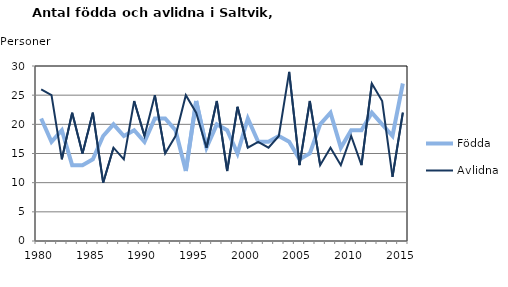
| Category | Födda | Avlidna |
|---|---|---|
| 1980.0 | 21 | 26 |
| 1981.0 | 17 | 25 |
| 1982.0 | 19 | 14 |
| 1983.0 | 13 | 22 |
| 1984.0 | 13 | 15 |
| 1985.0 | 14 | 22 |
| 1986.0 | 18 | 10 |
| 1987.0 | 20 | 16 |
| 1988.0 | 18 | 14 |
| 1989.0 | 19 | 24 |
| 1990.0 | 17 | 18 |
| 1991.0 | 21 | 25 |
| 1992.0 | 21 | 15 |
| 1993.0 | 19 | 18 |
| 1994.0 | 12 | 25 |
| 1995.0 | 24 | 22 |
| 1996.0 | 16 | 16 |
| 1997.0 | 20 | 24 |
| 1998.0 | 19 | 12 |
| 1999.0 | 15 | 23 |
| 2000.0 | 21 | 16 |
| 2001.0 | 17 | 17 |
| 2002.0 | 17 | 16 |
| 2003.0 | 18 | 18 |
| 2004.0 | 17 | 29 |
| 2005.0 | 14 | 13 |
| 2006.0 | 15 | 24 |
| 2007.0 | 20 | 13 |
| 2008.0 | 22 | 16 |
| 2009.0 | 16 | 13 |
| 2010.0 | 19 | 18 |
| 2011.0 | 19 | 13 |
| 2012.0 | 22 | 27 |
| 2013.0 | 20 | 24 |
| 2014.0 | 18 | 11 |
| 2015.0 | 27 | 22 |